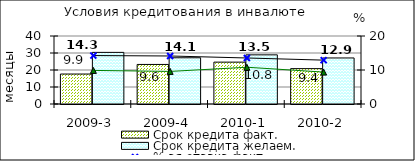
| Category | Срок кредита факт.  | Срок кредита желаем. |
|---|---|---|
| 2009-3 | 17.62 | 30.36 |
| 2009-4 | 23.27 | 27.19 |
| 2010-1 | 24.63 | 28.91 |
| 2010-2 | 20.8 | 27.08 |